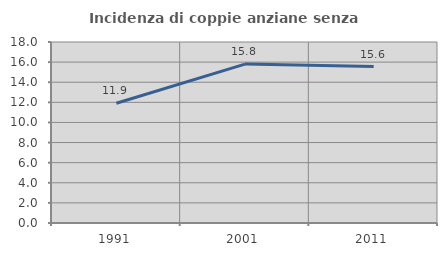
| Category | Incidenza di coppie anziane senza figli  |
|---|---|
| 1991.0 | 11.913 |
| 2001.0 | 15.802 |
| 2011.0 | 15.558 |